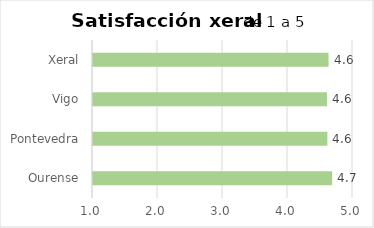
| Category | Satisfacción xeral |
|---|---|
| Ourense | 4.679 |
| Pontevedra | 4.606 |
| Vigo | 4.599 |
| Xeral | 4.624 |